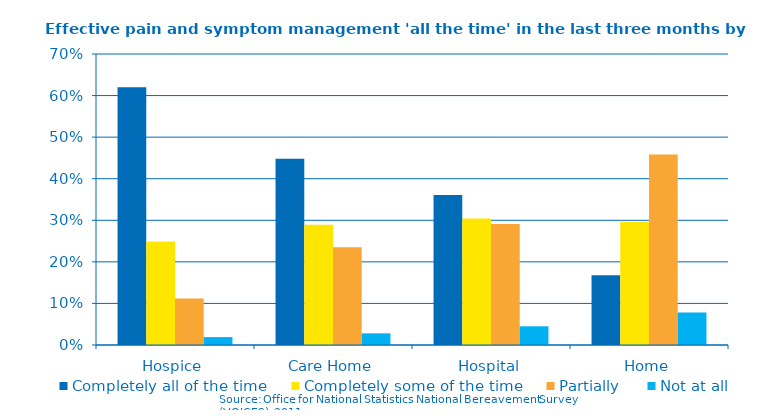
| Category | Completely all of the time | Completely some of the time | Partially | Not at all |
|---|---|---|---|---|
| Hospice | 0.62 | 0.249 | 0.112 | 0.019 |
| Care Home | 0.448 | 0.289 | 0.235 | 0.028 |
| Hospital | 0.361 | 0.304 | 0.291 | 0.045 |
| Home | 0.168 | 0.296 | 0.458 | 0.078 |